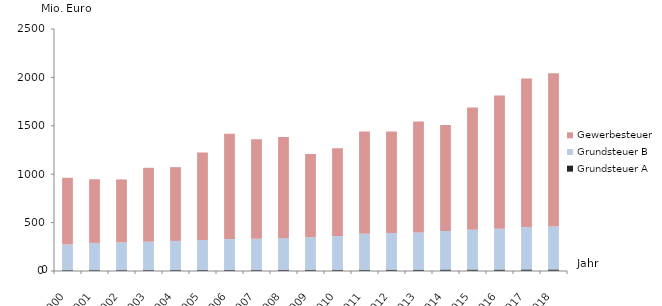
| Category | Grundsteuer A | Grundsteuer B | Gewerbesteuer |
|---|---|---|---|
| 2000.0 | 17 | 257 | 689 |
| 2001.0 | 18 | 272 | 658 |
| 2002.0 | 18 | 278 | 650 |
| 2003.0 | 18 | 285 | 763 |
| 2004.0 | 19 | 292 | 762 |
| 2005.0 | 19 | 301 | 905 |
| 2006.0 | 19 | 311 | 1087 |
| 2007.0 | 19 | 314 | 1027 |
| 2008.0 | 20 | 319 | 1046 |
| 2009.0 | 20 | 328 | 861 |
| 2010.0 | 20 | 341 | 906 |
| 2011.0 | 20 | 364 | 1057 |
| 2012.0 | 21 | 371 | 1050 |
| 2013.0 | 21 | 378 | 1146 |
| 2014.0 | 22 | 392 | 1094 |
| 2015.0 | 22 | 404 | 1262 |
| 2016.0 | 22 | 414 | 1376 |
| 2017.0 | 23 | 431 | 1534 |
| 2018.0 | 23 | 437 | 1582 |